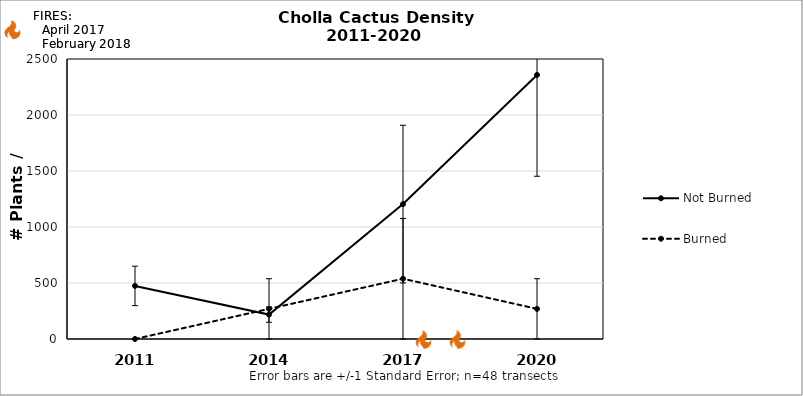
| Category | Not Burned | Burned |
|---|---|---|
| 2011.0 | 474.124 | 0 |
| 2014.0 | 217.841 | 269.098 |
| 2017.0 | 1204.532 | 538.195 |
| 2020.0 | 2357.807 | 269.098 |